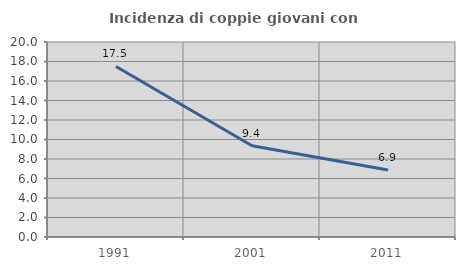
| Category | Incidenza di coppie giovani con figli |
|---|---|
| 1991.0 | 17.488 |
| 2001.0 | 9.355 |
| 2011.0 | 6.879 |